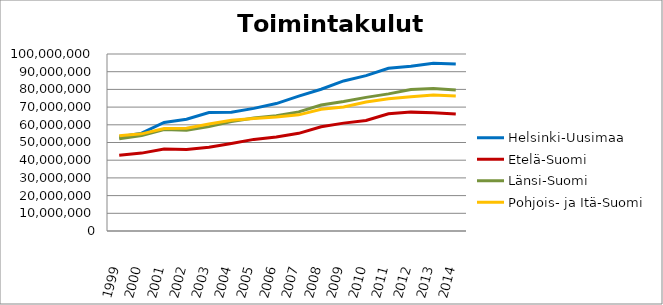
| Category | Helsinki-Uusimaa | Etelä-Suomi | Länsi-Suomi | Pohjois- ja Itä-Suomi |
|---|---|---|---|---|
| 1999.0 | 53139603.01 | 42832526.72 | 52150984.17 | 53807645.36 |
| 2000.0 | 55271430.04 | 44005755.95 | 53957387.63 | 54890797.17 |
| 2001.0 | 61300760.7 | 46301684.79 | 57385138.41 | 57948696.22 |
| 2002.0 | 63182321 | 45991324 | 56928210 | 58013324 |
| 2003.0 | 66920228 | 47348911 | 58966787 | 60499885 |
| 2004.0 | 67137587 | 49438831 | 61804218 | 62537906 |
| 2005.0 | 69271591 | 51757715 | 63821411 | 63623010 |
| 2006.0 | 71998072 | 53165773 | 65071935 | 64456210 |
| 2007.0 | 76163446 | 55166747 | 67293322 | 65629361 |
| 2008.0 | 80104282 | 58858383.2 | 71218395.17 | 68828152.31 |
| 2009.0 | 84786140.91 | 60952127.66 | 73204893.39 | 70115396.9 |
| 2010.0 | 87756445.23 | 62412081.64 | 75497137.35 | 72835803.54 |
| 2011.0 | 91894197.23 | 66220055.25 | 77480788.87 | 74710727.89 |
| 2012.0 | 93126919.74 | 67160242.33 | 79915019.23 | 75835999.72 |
| 2013.0 | 94823849.84 | 66840900.27 | 80493594.09 | 76903187.31 |
| 2014.0 | 94405710.95 | 66102470.18 | 79648418.75 | 76273907.88 |